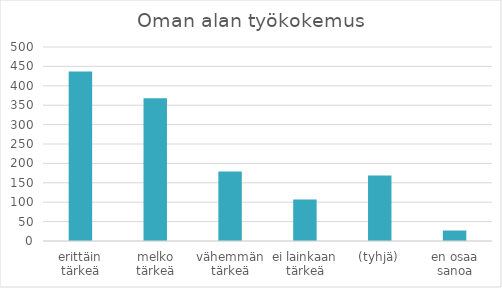
| Category | Summa |
|---|---|
| erittäin tärkeä | 437 |
| melko tärkeä | 368 |
| vähemmän tärkeä | 179 |
| ei lainkaan tärkeä | 107 |
| (tyhjä) | 169 |
| en osaa sanoa | 27 |